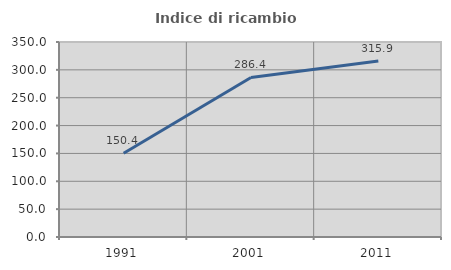
| Category | Indice di ricambio occupazionale  |
|---|---|
| 1991.0 | 150.442 |
| 2001.0 | 286.413 |
| 2011.0 | 315.929 |